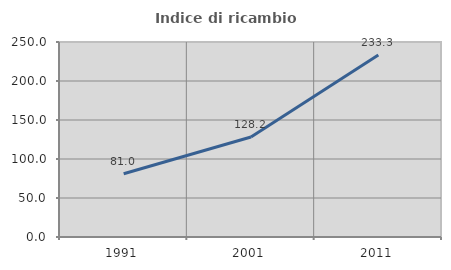
| Category | Indice di ricambio occupazionale  |
|---|---|
| 1991.0 | 81.034 |
| 2001.0 | 128.205 |
| 2011.0 | 233.333 |